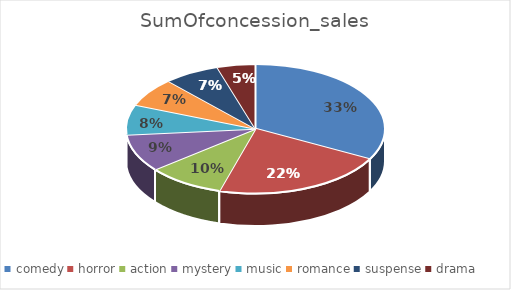
| Category | SumOfconcession_sales |
|---|---|
| comedy | 1947728 |
| horror | 1287975 |
| action | 571372 |
| mystery | 558545 |
| music | 446536 |
| romance | 425939 |
| suspense | 414133 |
| drama | 284408 |